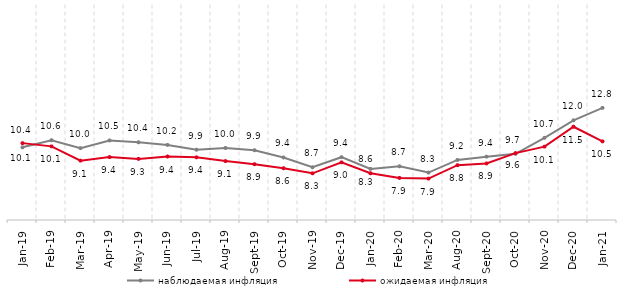
| Category | наблюдаемая инфляция | ожидаемая инфляция |
|---|---|---|
| 2019-01-01 | 10.071 | 10.363 |
| 2019-02-01 | 10.567 | 10.136 |
| 2019-03-01 | 10.013 | 9.141 |
| 2019-04-01 | 10.548 | 9.39 |
| 2019-05-01 | 10.421 | 9.264 |
| 2019-06-01 | 10.239 | 9.429 |
| 2019-07-01 | 9.904 | 9.371 |
| 2019-08-01 | 10.027 | 9.11 |
| 2019-09-01 | 9.867 | 8.894 |
| 2019-10-01 | 9.362 | 8.612 |
| 2019-11-01 | 8.68 | 8.257 |
| 2019-12-01 | 9.383 | 9.022 |
| 2020-01-01 | 8.566 | 8.259 |
| 2020-02-01 | 8.747 | 7.934 |
| 2020-03-01 | 8.311 | 7.888 |
| 2020-08-01 | 9.19 | 8.823 |
| 2020-09-01 | 9.419 | 8.948 |
| 2020-10-01 | 9.614 | 9.668 |
| 2020-11-01 | 10.734 | 10.121 |
| 2020-12-01 | 11.954 | 11.507 |
| 2021-01-01 | 12.821 | 10.484 |